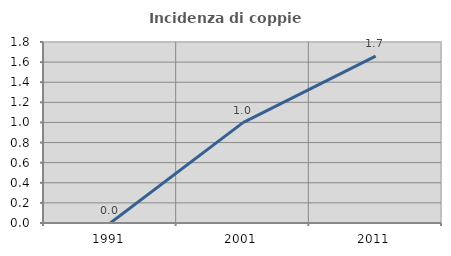
| Category | Incidenza di coppie miste |
|---|---|
| 1991.0 | 0 |
| 2001.0 | 0.998 |
| 2011.0 | 1.66 |